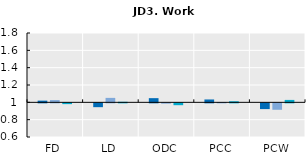
| Category | 2005 | 2010 | 2015 |
|---|---|---|---|
| FD | 1.02 | 1.026 | 0.991 |
| LD | 0.956 | 1.051 | 1.006 |
| ODC | 1.048 | 0.996 | 0.979 |
| PCC | 1.033 | 1.003 | 1.012 |
| PCW | 0.934 | 0.926 | 1.028 |